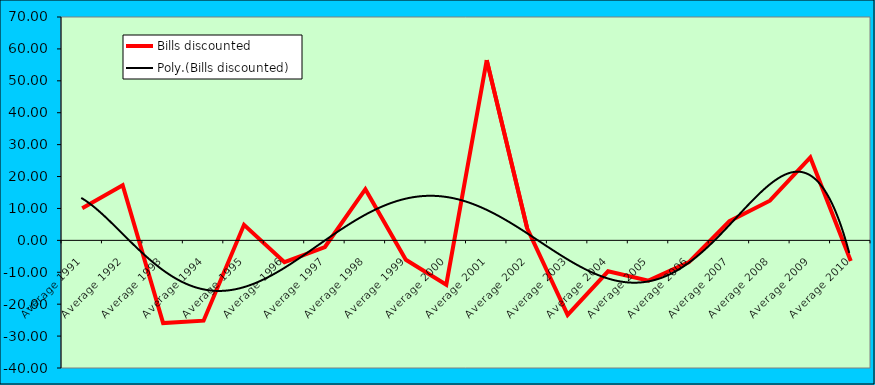
| Category | Bills discounted |
|---|---|
| Average 1991 | 10.042 |
| Average 1992 | 17.295 |
| Average 1993 | -25.925 |
| Average 1994 | -25.172 |
| Average 1995 | 4.88 |
| Average 1996 | -6.836 |
| Average 1997 | -2.085 |
| Average 1998 | 16.055 |
| Average 1999 | -6.067 |
| Average 2000 | -13.896 |
| Average 2001 | 56.494 |
| Average 2002 | 3.8 |
| Average 2003 | -23.373 |
| Average 2004 | -9.691 |
| Average 2005 | -12.635 |
| Average 2006 | -6.814 |
| Average 2007 | 6.033 |
| Average 2008 | 12.426 |
| Average 2009 | 25.971 |
| Average 2010 | -6.457 |